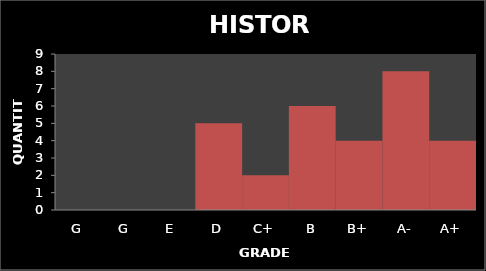
| Category | Quantity |
|---|---|
| G | 0 |
| G | 0 |
| E | 0 |
| D | 5 |
| C+ | 2 |
| B | 6 |
| B+ | 4 |
| A- | 8 |
| A+ | 4 |